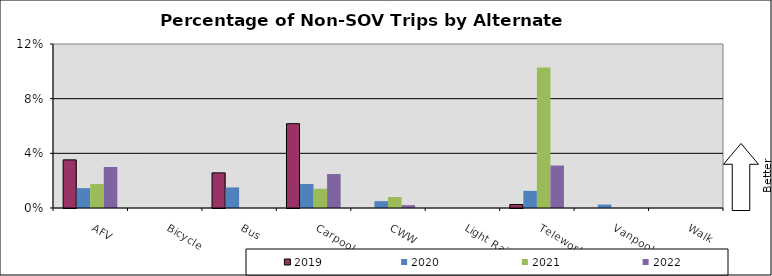
| Category | 2019 | 2020 | 2021 | 2022 |
|---|---|---|---|---|
| AFV | 0.035 | 0.015 | 0.018 | 0.03 |
| Bicycle | 0 | 0 | 0 | 0 |
| Bus | 0.026 | 0.015 | 0 | 0 |
| Carpool | 0.062 | 0.018 | 0.014 | 0.025 |
| CWW | 0 | 0.005 | 0.008 | 0.002 |
| Light Rail | 0 | 0 | 0 | 0 |
| Telework | 0.003 | 0.013 | 0.103 | 0.031 |
| Vanpool | 0 | 0.003 | 0 | 0 |
| Walk | 0 | 0 | 0 | 0 |